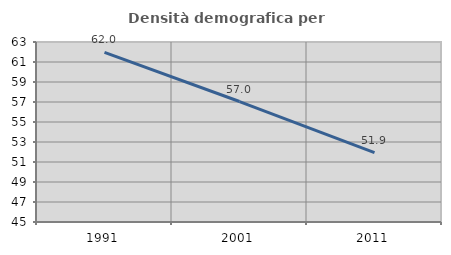
| Category | Densità demografica |
|---|---|
| 1991.0 | 61.971 |
| 2001.0 | 57.047 |
| 2011.0 | 51.934 |